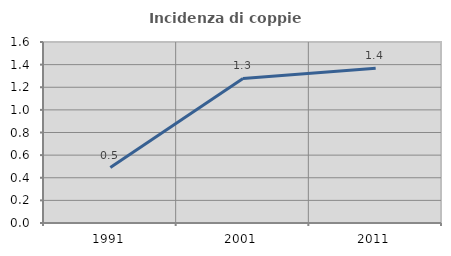
| Category | Incidenza di coppie miste |
|---|---|
| 1991.0 | 0.49 |
| 2001.0 | 1.277 |
| 2011.0 | 1.369 |